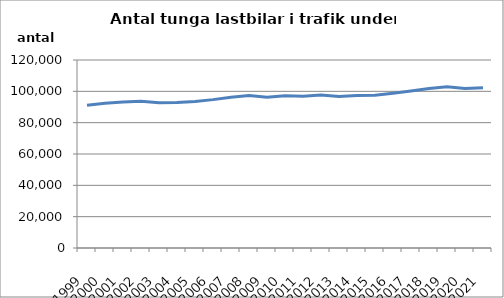
| Category | Series 0 |
|---|---|
| 1999.0 | 91088 |
| 2000.0 | 92349 |
| 2001.0 | 93203 |
| 2002.0 | 93717 |
| 2003.0 | 92752 |
| 2004.0 | 92807 |
| 2005.0 | 93548 |
| 2006.0 | 94702 |
| 2007.0 | 96277 |
| 2008.0 | 97317 |
| 2009.0 | 96187 |
| 2010.0 | 97217 |
| 2011.0 | 96850 |
| 2012.0 | 97661 |
| 2013.0 | 96749 |
| 2014.0 | 97364 |
| 2015.0 | 97469 |
| 2016.0 | 98746 |
| 2017.0 | 100233 |
| 2018.0 | 101773 |
| 2019.0 | 102922 |
| 2020.0 | 101831 |
| 2021.0 | 102235 |